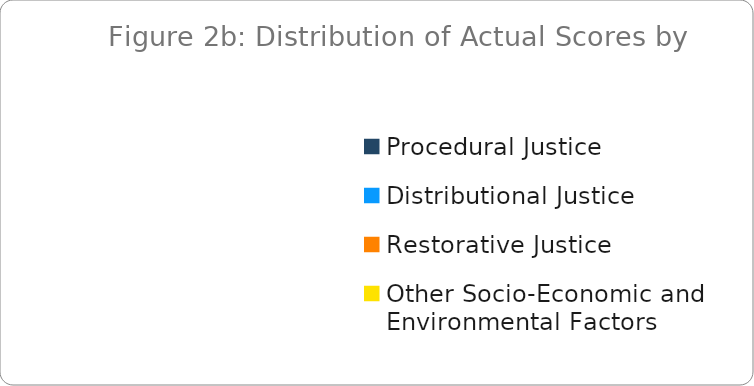
| Category | Series 0 |
|---|---|
| Procedural Justice | 0 |
| Distributional Justice | 0 |
| Restorative Justice | 0 |
| Other Socio-Economic and Environmental Factors | 0 |